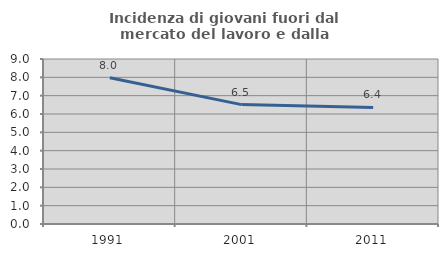
| Category | Incidenza di giovani fuori dal mercato del lavoro e dalla formazione  |
|---|---|
| 1991.0 | 7.979 |
| 2001.0 | 6.513 |
| 2011.0 | 6.358 |